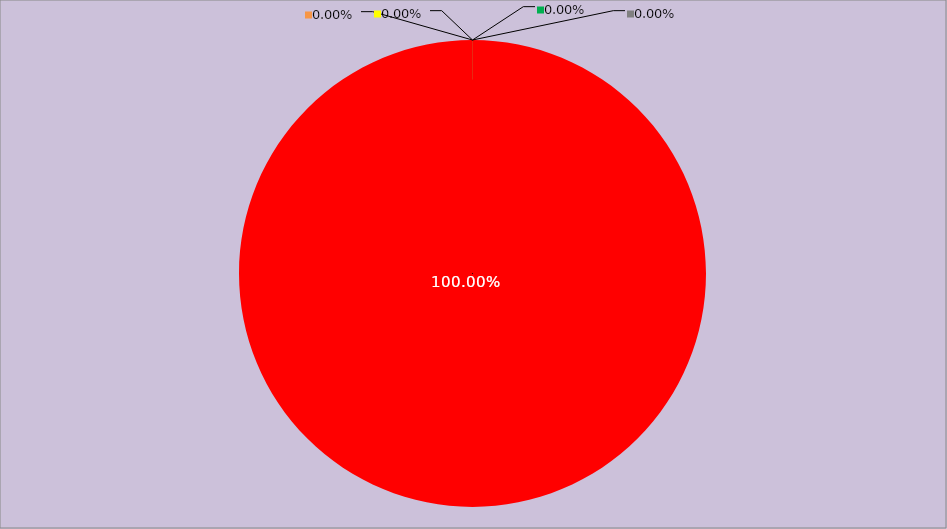
| Category | Année 2024 |
|---|---|
| Mesures non appliquées | 168 |
| Mesures appliquées mais peu ou pas documentées | 0 |
| Mesures appliquées et documentées | 0 |
| Mesures appliquées, documentées et contrôlées | 0 |
| Mesures non applicables | 0 |